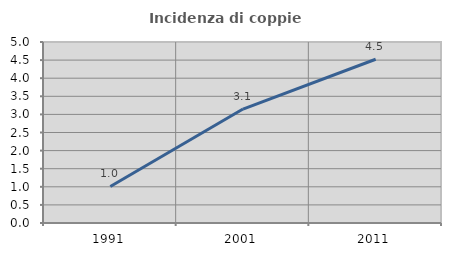
| Category | Incidenza di coppie miste |
|---|---|
| 1991.0 | 1.009 |
| 2001.0 | 3.147 |
| 2011.0 | 4.523 |